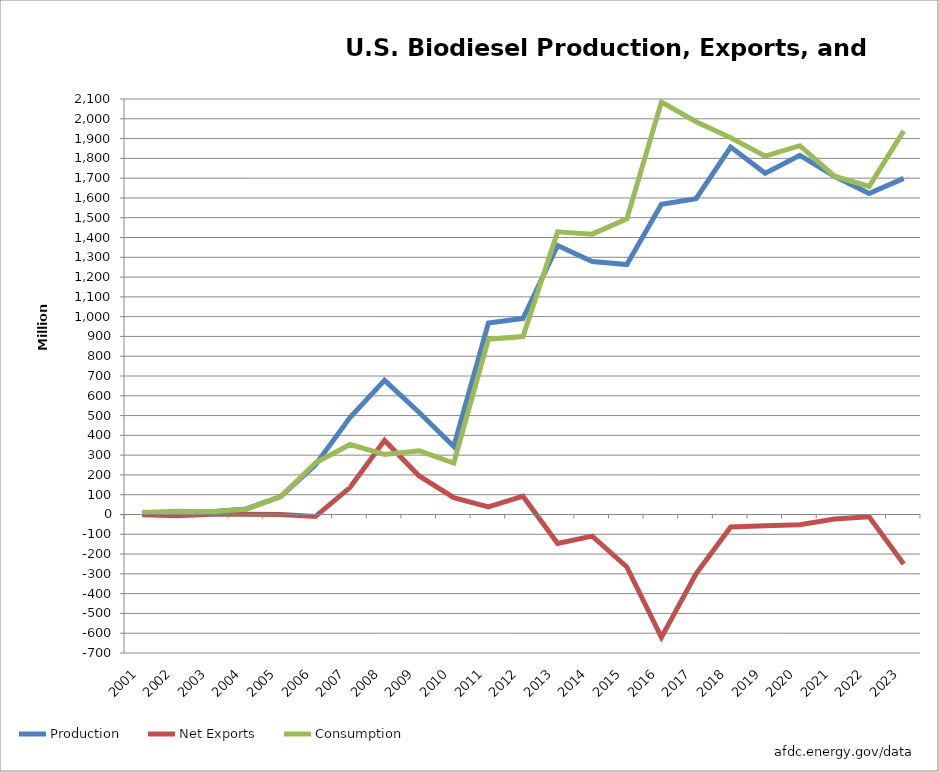
| Category | Production | Net Exports | Consumption |
|---|---|---|---|
| 2001.0 | 8.577 | -1.68 | 10.213 |
| 2002.0 | 10.484 | -5.88 | 16.168 |
| 2003.0 | 14.21 | 0.672 | 13.533 |
| 2004.0 | 27.982 | 1.134 | 26.878 |
| 2005.0 | 90.787 | -0.042 | 90.827 |
| 2006.0 | 250.439 | -10.458 | 260.584 |
| 2007.0 | 489.825 | 136.122 | 353.708 |
| 2008.0 | 678.106 | 374.556 | 303.556 |
| 2009.0 | 515.802 | 194.88 | 321.832 |
| 2010.0 | 343.434 | 85.008 | 260.075 |
| 2011.0 | 967.428 | 38.178 | 885.877 |
| 2012.0 | 990.711 | 92.526 | 899.046 |
| 2013.0 | 1359.456 | -146.034 | 1428.84 |
| 2014.0 | 1279 | -109.368 | 1417 |
| 2015.0 | 1263 | -264.936 | 1494 |
| 2016.0 | 1568 | -620.802 | 2085 |
| 2017.0 | 1596 | -300.132 | 1985 |
| 2018.0 | 1857 | -62.958 | 1904 |
| 2019.0 | 1725 | -56.616 | 1811 |
| 2020.0 | 1815 | -51.492 | 1864 |
| 2021.0 | 1709 | -23.226 | 1710 |
| 2022.0 | 1622 | -11.718 | 1658 |
| 2023.0 | 1699 | -249.858 | 1939 |